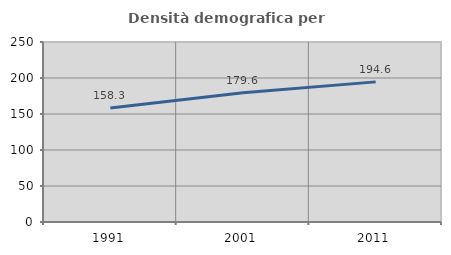
| Category | Densità demografica |
|---|---|
| 1991.0 | 158.343 |
| 2001.0 | 179.592 |
| 2011.0 | 194.613 |